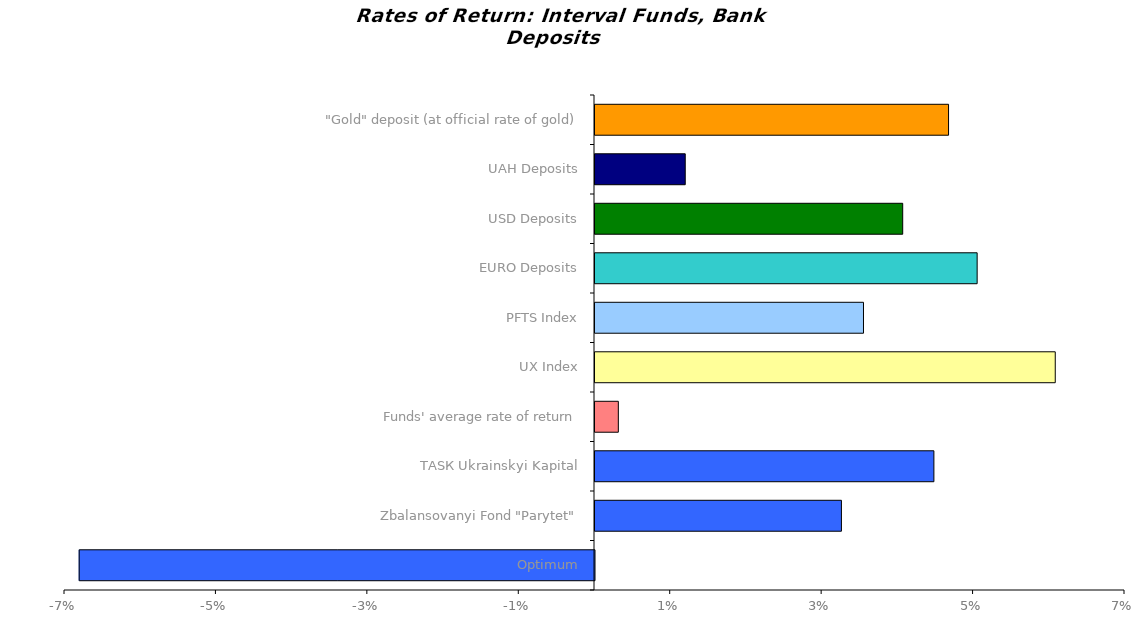
| Category | Series 0 |
|---|---|
| Optimum | -0.068 |
| Zbalansovanyi Fond "Parytet" | 0.033 |
| ТАSК Ukrainskyi Kapital | 0.045 |
| Funds' average rate of return | 0.003 |
| UX Index | 0.061 |
| PFTS Index | 0.035 |
| EURO Deposits | 0.05 |
| USD Deposits | 0.041 |
| UAH Deposits | 0.012 |
| "Gold" deposit (at official rate of gold) | 0.047 |